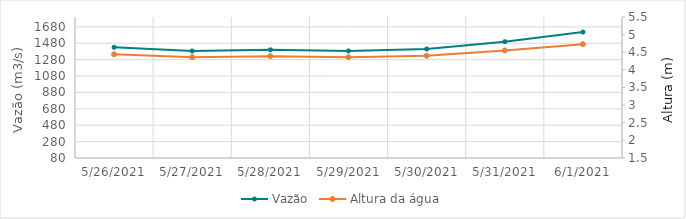
| Category | Vazão |
|---|---|
| 5/25/21 | 1510.73 |
| 5/24/21 | 1588.07 |
| 5/23/21 | 1663.11 |
| 5/22/21 | 1688.32 |
| 5/21/21 | 1639.97 |
| 5/20/21 | 1569.63 |
| 5/19/21 | 1460.7 |